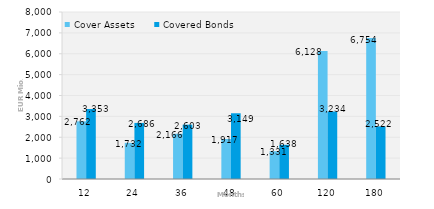
| Category | Cover Assets | Covered Bonds |
|---|---|---|
| 12.0 | 2762.034 | 3352.876 |
| 24.0 | 1731.577 | 2685.97 |
| 36.0 | 2166.48 | 2603.341 |
| 48.0 | 1917.336 | 3149.023 |
| 60.0 | 1330.681 | 1637.824 |
| 120.0 | 6127.628 | 3234.341 |
| 180.0 | 6754.346 | 2521.528 |